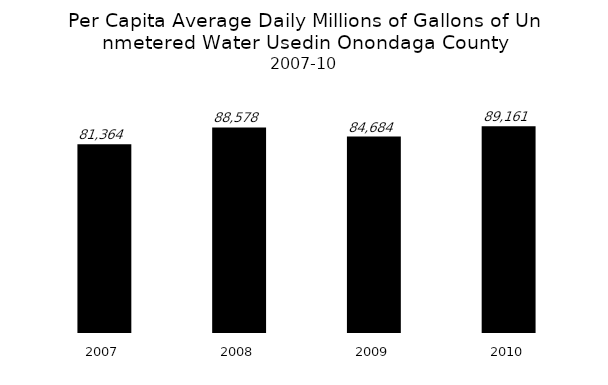
| Category | Series 0 |
|---|---|
| 2007.0 | 81363.799 |
| 2008.0 | 88577.886 |
| 2009.0 | 84683.985 |
| 2010.0 | 89161.069 |